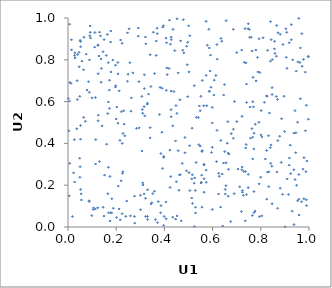
| Category | Series 0 |
|---|---|
| 0.9788830764701367 | 0.135 |
| 0.7382933071890104 | 0.785 |
| 0.922419389426752 | 0.391 |
| 0.5246746633130456 | 0.003 |
| 0.9009848426879103 | 0.001 |
| 0.13757059541510575 | 0.693 |
| 0.7861309197115104 | 0.812 |
| 0.8012970979670199 | 0.557 |
| 0.6066466531327434 | 0.703 |
| 0.7206055139371255 | 0.846 |
| 0.8918531277714573 | 0.873 |
| 0.9851581520181478 | 0.461 |
| 0.6503952192550411 | 0.361 |
| 0.39016531061259596 | 0.664 |
| 0.40634355737657857 | 0.12 |
| 0.8395344020329946 | 0.38 |
| 0.14166029385043155 | 0.484 |
| 0.9693484047753768 | 0.121 |
| 0.8329239313316334 | 0.193 |
| 0.6608357174120479 | 0.401 |
| 0.5238255741605297 | 0.21 |
| 0.9074897839846771 | 0.931 |
| 0.645327951556222 | 0.306 |
| 0.09363841455462474 | 0.904 |
| 0.22802641962514114 | 0.448 |
| 0.012447642685813554 | 0.688 |
| 0.2024713210498681 | 0.574 |
| 0.5914809882413423 | 0.822 |
| 0.35891170513379667 | 0.171 |
| 0.8716884901674705 | 0.929 |
| 0.18179256835252955 | 0.135 |
| 0.45722532153006346 | 0.365 |
| 0.04926195892515939 | 0.238 |
| 0.7479318064712766 | 0.252 |
| 0.5628640049237 | 0.58 |
| 0.0850969620247587 | 0.695 |
| 0.7006693236068876 | 0.504 |
| 0.16547356543540015 | 0.159 |
| 0.1978469605618598 | 0.676 |
| 0.5560725394042293 | 0.095 |
| 0.6528575206712514 | 0.158 |
| 0.0577415820642837 | 0.794 |
| 0.02618950449649926 | 0.418 |
| 0.06430454235327943 | 0.752 |
| 0.12521641857985966 | 0.733 |
| 0.39720550814002875 | 0.338 |
| 0.3004063152671168 | 0.152 |
| 0.7404438260157437 | 0.155 |
| 0.46039513637089746 | 0.176 |
| 0.05583095283742301 | 0.129 |
| 0.4966629162248133 | 0.624 |
| 0.6857580609108529 | 0.946 |
| 0.54073899095779 | 0.524 |
| 0.8328860955450558 | 0.264 |
| 0.3627456096981492 | 0.035 |
| 0.20757749254034075 | 0.497 |
| 0.1768780409662728 | 0.885 |
| 0.5647698343265182 | 0.231 |
| 0.9717300889171576 | 0.769 |
| 0.1878762427767955 | 0.09 |
| 0.3987734250324808 | 0.051 |
| 0.5735676920985348 | 0.214 |
| 0.2918097344787509 | 0.952 |
| 0.9086237270448997 | 0.759 |
| 0.99756643968055 | 0.817 |
| 0.10615950743816882 | 0.092 |
| 0.014698193202679843 | 0.848 |
| 0.11410745307937187 | 0.619 |
| 0.6862797325193554 | 0.468 |
| 0.409765797323961 | 0.761 |
| 0.7050050431588264 | 0.277 |
| 0.23964999315275015 | 0.051 |
| 0.7272797076878672 | 0.152 |
| 0.7477184067683503 | 0.948 |
| 0.40787600807414814 | 0.654 |
| 0.8904848594815173 | 0.157 |
| 0.8468103401479596 | 0.634 |
| 0.15158947626140984 | 0.248 |
| 0.564307607845407 | 0.297 |
| 0.8258029213869033 | 0.625 |
| 0.37993986850533745 | 0.538 |
| 0.51586220676476 | 0.25 |
| 0.06494751309574442 | 0.524 |
| 0.2769418660654832 | 0.018 |
| 0.8279613476488047 | 0.262 |
| 0.037958230017644534 | 0.7 |
| 0.45249228165181055 | 0.053 |
| 0.3215328176127893 | 0.909 |
| 0.9752978211261253 | 0.277 |
| 0.7995915645724786 | 0.238 |
| 0.20003465051286917 | 0.517 |
| 0.050472322563464456 | 0.893 |
| 0.9624332062783065 | 0.787 |
| 0.4644227741199425 | 0.609 |
| 0.3411798170687804 | 0.824 |
| 0.6341779589416399 | 0.414 |
| 0.39256466865036355 | 0.28 |
| 0.19718787627959644 | 0.669 |
| 0.3543116415377553 | 0.932 |
| 0.3168423477531854 | 0.728 |
| 0.6554537561566522 | 0.198 |
| 0.4759097856479214 | 0.846 |
| 0.788018936689581 | 0.742 |
| 0.6525291774734043 | 0.18 |
| 0.6182880074683472 | 0.462 |
| 0.7794856989981469 | 0.847 |
| 0.6137346590519028 | 0.725 |
| 0.5257013404951963 | 0.235 |
| 0.7667410620202002 | 0.326 |
| 0.036537463048250896 | 0.47 |
| 0.7519884673999923 | 0.945 |
| 0.006253275116668622 | 0.602 |
| 0.22462729882480748 | 0.879 |
| 0.7574993245875702 | 0.425 |
| 0.6052917720973204 | 0.631 |
| 0.359358484337032 | 0.734 |
| 0.937946357750658 | 0.011 |
| 0.663274372082392 | 0.504 |
| 0.4234886691871771 | 0.189 |
| 0.9577212795687228 | 0.998 |
| 0.25373326832232634 | 0.948 |
| 0.7212394964750922 | 0.274 |
| 0.9146967598435058 | 0.155 |
| 0.6561115781707576 | 0.987 |
| 0.04897341246033626 | 0.625 |
| 0.3228856144311917 | 0.876 |
| 0.8702857374086754 | 0.414 |
| 0.2245338575189153 | 0.064 |
| 0.814946428758561 | 0.597 |
| 0.5522748240611344 | 0.211 |
| 0.21207279755472952 | 0.086 |
| 0.0878533524828331 | 0.125 |
| 0.4918684270011062 | 0.865 |
| 0.3438220107121758 | 0.672 |
| 0.9909553667037516 | 0.316 |
| 0.9642075798607271 | 0.857 |
| 0.052092967386128564 | 0.42 |
| 0.8659688262326879 | 0.964 |
| 0.8473454626048769 | 0.801 |
| 0.8695974765367401 | 0.61 |
| 0.4189729619461101 | 0.759 |
| 0.5862513613899314 | 0.857 |
| 0.7764711677575098 | 0.077 |
| 0.13089056670775723 | 0.313 |
| 0.17174233751759416 | 0.655 |
| 0.24700931754333288 | 0.929 |
| 0.5239500575731835 | 0.676 |
| 0.7715454594392036 | 0.17 |
| 0.5049280016230397 | 0.389 |
| 0.48537794038931215 | 0.355 |
| 0.8094717363896623 | 0.906 |
| 0.9588225335184156 | 0.057 |
| 0.8413037372047407 | 0.304 |
| 0.14925801575140096 | 0.052 |
| 0.32201505896335925 | 0.05 |
| 0.3287276220706685 | 0.588 |
| 0.9575607454515153 | 0.133 |
| 0.028942802642488275 | 0.833 |
| 0.9486735641276742 | 0.199 |
| 0.9039630232722509 | 0.948 |
| 0.7346892622683334 | 0.949 |
| 0.11525992293871001 | 0.418 |
| 0.20876669203088627 | 0.196 |
| 0.14577898659285105 | 0.094 |
| 0.10448045750653112 | 0.084 |
| 0.11063017823287968 | 0.861 |
| 0.598904352510975 | 0.084 |
| 0.046534256561774456 | 0.766 |
| 0.43569323831768414 | 0.946 |
| 0.3304369704858645 | 0.036 |
| 0.5280730686701354 | 0.175 |
| 0.4392688701106644 | 0.648 |
| 0.5868263556539096 | 0.65 |
| 0.16494405635142362 | 0.543 |
| 0.7650191477155217 | 0.055 |
| 0.42502142216839933 | 0.875 |
| 0.20137354168486088 | 0.045 |
| 0.09217879022033748 | 0.931 |
| 0.2311375772875267 | 0.556 |
| 0.564848076367678 | 0.167 |
| 0.9418712209915094 | 0.227 |
| 0.3898238184745393 | 0.453 |
| 0.43469263399967883 | 0.484 |
| 0.344399637731275 | 0.11 |
| 0.9526292796924435 | 0.501 |
| 0.9582303029637308 | 0.251 |
| 0.13454905232939318 | 0.914 |
| 0.9899042573547616 | 0.102 |
| 0.4284094020128212 | 0.909 |
| 0.22054653497255694 | 0.221 |
| 0.2467759460425757 | 0.697 |
| 0.04580243187503619 | 0.836 |
| 0.9967554322299186 | 0.814 |
| 0.7696754126983404 | 0.575 |
| 0.7711898886860215 | 0.373 |
| 0.49487723718483123 | 0.776 |
| 0.5556890239525735 | 0.361 |
| 0.31084274522242383 | 0.201 |
| 0.5289327664910526 | 0.067 |
| 0.9302433048715683 | 0.076 |
| 0.16037425152207607 | 0.396 |
| 0.4071750474420016 | 0.039 |
| 0.5983778175819708 | 0.572 |
| 0.06614565831284269 | 0.908 |
| 0.12487502026103714 | 0.508 |
| 0.2954116916967424 | 0.474 |
| 0.050383479496209804 | 0.288 |
| 0.443094810235769 | 0.844 |
| 0.7412850686459859 | 0.596 |
| 0.57317628970844 | 0.984 |
| 0.7770699617502416 | 0.492 |
| 0.3715509850451689 | 0.021 |
| 0.004109447909577124 | 0.46 |
| 0.4740302208613534 | 0.304 |
| 0.006917259156896671 | 0.304 |
| 0.970324820137209 | 0.925 |
| 0.9368520280987591 | 0.449 |
| 0.36636135480245013 | 0.89 |
| 0.23560333707096248 | 0.436 |
| 0.038873171487743274 | 0.61 |
| 0.9871576912779718 | 0.265 |
| 0.14556890022457702 | 0.839 |
| 0.8696138619852614 | 0.089 |
| 0.005029340211640587 | 0.149 |
| 0.17766946025558372 | 0.069 |
| 0.5487017971106336 | 0.387 |
| 0.0889743558811622 | 0.645 |
| 0.05215404628095177 | 0.486 |
| 0.7663725204933971 | 0.43 |
| 0.9267203235396823 | 0.968 |
| 0.640000731731857 | 0.253 |
| 0.937086474164822 | 0.274 |
| 0.7392725490903436 | 0.395 |
| 0.8238301316289355 | 0.627 |
| 0.9264226385302766 | 0.896 |
| 0.9188516388722457 | 0.33 |
| 0.9325826518353123 | 0.8 |
| 0.6774510289119021 | 0.447 |
| 0.500386315313976 | 0.963 |
| 0.9096549176113312 | 0.23 |
| 0.5732542230182486 | 0.726 |
| 0.6276295128694394 | 0.243 |
| 0.7941175434423031 | 0.05 |
| 0.7356604698555738 | 0.03 |
| 0.5864771343540965 | 0.649 |
| 0.19695746489892996 | 0.774 |
| 0.8458771008491125 | 0.29 |
| 0.8045689596386693 | 0.431 |
| 0.2842288585420508 | 0.472 |
| 0.41180602647156983 | 0.729 |
| 0.7804707786292285 | 0.699 |
| 0.3696041021049229 | 0.951 |
| 0.5057710590017306 | 0.174 |
| 0.3158528646399652 | 0.576 |
| 0.8782560624427771 | 0.434 |
| 0.11346663151394198 | 0.086 |
| 0.8806544015044495 | 0.922 |
| 0.7198377164430155 | 0.074 |
| 0.15907422043943165 | 0.821 |
| 0.9529509824511145 | 0.125 |
| 0.5515238792398056 | 0.625 |
| 0.5954124800391235 | 0.357 |
| 0.42802819975690387 | 0.65 |
| 0.6160051383527008 | 0.313 |
| 0.763378258421728 | 0.47 |
| 0.9179026715155824 | 0.882 |
| 0.5148105389704084 | 0.473 |
| 0.3478964414410187 | 0.116 |
| 0.5326977484151305 | 0.525 |
| 0.26111336480962133 | 0.554 |
| 0.8861093169875923 | 0.518 |
| 0.3296961430154385 | 0.051 |
| 0.9847876221951813 | 0.741 |
| 0.5548248548260684 | 0.248 |
| 0.4464359980158378 | 0.412 |
| 0.08780951576311835 | 0.122 |
| 0.3083939626663832 | 0.562 |
| 0.3663129659429071 | 0.821 |
| 0.9972631809582544 | 0.516 |
| 0.4466419541183815 | 0.038 |
| 0.1684909965561885 | 0.068 |
| 0.8566640994979111 | 0.852 |
| 0.7642651151228755 | 0.842 |
| 0.531691081643324 | 0.309 |
| 0.3065060827660486 | 0.364 |
| 0.7477738161823179 | 0.188 |
| 0.7934166982831142 | 0.206 |
| 0.553547765281652 | 0.214 |
| 0.4278098655829041 | 0.562 |
| 0.8849297527715001 | 0.309 |
| 0.6661837981214132 | 0.276 |
| 0.5290186694659768 | 0.095 |
| 0.29439866326827213 | 0.696 |
| 0.5986835769145513 | 0.498 |
| 0.7719875756107286 | 0.449 |
| 0.7228236875297045 | 0.287 |
| 0.6645133373027232 | 0.353 |
| 0.48070693591810887 | 0.833 |
| 0.7541948252287335 | 0.908 |
| 0.3301319412602688 | 0.178 |
| 0.8402377162706207 | 0.983 |
| 0.7921894760078803 | 0.501 |
| 0.2757566347520435 | 0.148 |
| 0.31027629003296997 | 0.211 |
| 0.4212212560046854 | 0.99 |
| 0.1143334673801718 | 0.301 |
| 0.17233875627389206 | 0.702 |
| 0.6193290229466867 | 0.803 |
| 0.7366363539746595 | 0.265 |
| 0.575469492237129 | 0.58 |
| 0.7678769336042989 | 0.716 |
| 0.8398850668602286 | 0.793 |
| 0.4852965210839869 | 0.428 |
| 0.17376192049074646 | 0.242 |
| 0.5053988810875789 | 0.915 |
| 0.4263673104515042 | 0.241 |
| 0.007823327640482658 | 0.692 |
| 0.13737833234332952 | 0.804 |
| 0.667684180320692 | 0.349 |
| 0.04015463097354466 | 0.825 |
| 0.30651133772923245 | 0.625 |
| 0.17753456255719757 | 0.938 |
| 0.24381492910116354 | 0.124 |
| 0.8242586995053112 | 0.366 |
| 0.723412219200501 | 0.166 |
| 0.3821229997134661 | 0.668 |
| 0.1631448812109042 | 0.921 |
| 0.39631185523884627 | 0.963 |
| 0.18075463994690277 | 0.067 |
| 0.5931754705047153 | 0.669 |
| 0.12423195920209795 | 0.869 |
| 0.49172476106052365 | 0.269 |
| 0.5484412193671911 | 0.556 |
| 0.09182984703702146 | 0.962 |
| 0.08892800346631058 | 0.8 |
| 0.8281856213084362 | 0.845 |
| 0.2915295262835558 | 0.913 |
| 0.9772068808031642 | 0.802 |
| 0.21559700414266036 | 0.415 |
| 0.502351822322706 | 0.742 |
| 0.07191384867572281 | 0.506 |
| 0.38595793823487723 | 0.102 |
| 0.792665979536697 | 0.901 |
| 0.38549761357664314 | 0.351 |
| 0.5900748095456548 | 0.746 |
| 0.3407161734742328 | 0.426 |
| 0.3843988963336886 | 0.068 |
| 0.25680805195516443 | 0.786 |
| 0.46563887532018344 | 0.25 |
| 0.6245083715584872 | 0.158 |
| 0.8646196681046784 | 0.817 |
| 0.5024496204420347 | 0.26 |
| 0.316752246470688 | 0.662 |
| 0.6255600722163915 | 0.257 |
| 0.7316497065680242 | 0.788 |
| 0.6649672008802103 | 0.148 |
| 0.8588355944336484 | 0.83 |
| 0.5572294760222466 | 0.365 |
| 0.4573297259598823 | 0.737 |
| 0.5131972092283129 | 0.139 |
| 0.45193254883975265 | 0.543 |
| 0.4283630045737371 | 0.528 |
| 0.7560681429229573 | 0.574 |
| 0.9889733060216763 | 0.13 |
| 0.12313709526893302 | 0.092 |
| 0.8470897162842106 | 0.111 |
| 0.5781451219719983 | 0.87 |
| 0.12836368920481533 | 0.818 |
| 0.7371810994304477 | 0.378 |
| 0.3742575874905646 | 0.121 |
| 0.428795133268532 | 0.896 |
| 0.32993938410859525 | 0.592 |
| 0.9055769015520542 | 0.812 |
| 0.7293479446973019 | 0.266 |
| 0.2757267602149327 | 0.051 |
| 0.8038946744654075 | 0.053 |
| 0.8806453097506495 | 0.186 |
| 0.21265791482867347 | 0.651 |
| 0.07912786639251623 | 0.655 |
| 0.05201610642999832 | 0.18 |
| 0.7666612784485285 | 0.599 |
| 0.3009032232409853 | 0.083 |
| 0.7602370979009195 | 0.908 |
| 0.947391823448269 | 0.746 |
| 0.8422851197789122 | 0.393 |
| 0.6351602848802358 | 0.902 |
| 0.39724777124640387 | 0.333 |
| 0.37045326955100566 | 0.925 |
| 0.7126329371993323 | 0.193 |
| 0.7404811365912543 | 0.684 |
| 0.23294110062038442 | 0.492 |
| 0.564626553164157 | 0.3 |
| 0.5430287493675023 | 0.394 |
| 0.40878875351254007 | 0.882 |
| 0.44805347757581504 | 0.581 |
| 0.6457250414392742 | 0.632 |
| 0.22604805640612602 | 0.256 |
| 0.3931239537590445 | 0.956 |
| 0.3341964212503863 | 0.636 |
| 0.9893091161640917 | 0.583 |
| 0.8666593694349821 | 0.263 |
| 0.7004010820543147 | 0.834 |
| 0.49663417063649384 | 0.884 |
| 0.01841617890409608 | 0.05 |
| 0.5133085164078875 | 0.23 |
| 0.3518285371276333 | 0.16 |
| 0.0291833724494569 | 0.809 |
| 0.052092796740600855 | 0.862 |
| 0.6894931477910153 | 0.159 |
| 0.6751074933064569 | 0.026 |
| 0.40679554847164534 | 0.904 |
| 0.8007122828803034 | 0.441 |
| 0.027317261538046034 | 0.215 |
| 0.2493422907192957 | 0.731 |
| 0.618053841987043 | 0.873 |
| 0.979017132807881 | 0.332 |
| 0.8989385498530797 | 0.456 |
| 0.5846711615846395 | 0.946 |
| 0.31594012360252066 | 0.158 |
| 0.42271512048331383 | 0.368 |
| 0.16738027817912338 | 0.787 |
| 0.216863587233164 | 0.034 |
| 0.6561142486820779 | 0.307 |
| 0.6329674835873351 | 0.095 |
| 0.8320606970423614 | 0.437 |
| 0.8643005827030631 | 0.624 |
| 0.16753724922087232 | 0.285 |
| 0.20778541664131245 | 0.733 |
| 0.9179054163250285 | 0.296 |
| 0.1259278965538737 | 0.535 |
| 0.17197922312785519 | 0.568 |
| 0.09025318550865147 | 0.915 |
| 0.9419421135515267 | 0.557 |
| 0.7221692548403635 | 0.529 |
| 0.6380937768344286 | 0.889 |
| 0.17426172311854227 | 0.029 |
| 0.7239720740500679 | 0.174 |
| 0.5166135165350463 | 0.113 |
| 0.857270396458447 | 0.888 |
| 0.9641436703483158 | 0.614 |
| 0.26293832170321607 | 0.618 |
| 0.13842592294257738 | 0.759 |
| 0.46263196972920506 | 0.249 |
| 0.09982484685219295 | 0.618 |
| 0.0987221755435268 | 0.054 |
| 0.4347814305993619 | 0.047 |
| 0.14975864607064393 | 0.897 |
| 0.8357945000373552 | 0.545 |
| 0.6491909628784247 | 0.681 |
| 0.7481163871379161 | 0.972 |
| 0.006192987699404684 | 0.97 |
| 0.2693323041920975 | 0.738 |
| 0.9244026976190725 | 0.256 |
| 0.11132448594179623 | 0.931 |
| 0.4788971016994791 | 0.992 |
| 0.34103048361607546 | 0.475 |
| 0.9449423365913078 | 0.356 |
| 0.31837279066202484 | 0.532 |
| 0.5733618157227761 | 0.272 |
| 0.2276777957186562 | 0.265 |
| 0.4671795879343652 | 0.891 |
| 0.2182989966061113 | 0.895 |
| 0.05451301634560968 | 0.159 |
| 0.8960594548471664 | 0.625 |
| 0.023092322202881377 | 0.259 |
| 0.027410364247804964 | 0.821 |
| 0.5574634525932739 | 0.702 |
| 0.001509781514464792 | 0.614 |
| 0.13068929027479537 | 0.932 |
| 0.39681687281073263 | 0.008 |
| 0.12462836787014508 | 0.871 |
| 0.8427653445063785 | 0.897 |
| 0.32173200621948306 | 0.137 |
| 0.9539720755116264 | 0.79 |
| 0.5450947273228095 | 0.579 |
| 0.186153349431737 | 0.799 |
| 0.22515592146832164 | 0.4 |
| 0.25902595019841457 | 0.053 |
| 0.206875307986631 | 0.787 |
| 0.8247522033012041 | 0.133 |
| 0.4494833710715156 | 0.216 |
| 0.6419202816945627 | 0.005 |
| 0.0518865378271981 | 0.887 |
| 0.31025410747770643 | 0.544 |
| 0.048256217406726476 | 0.329 |
| 0.6863535249325381 | 0.425 |
| 0.16761291137535328 | 0.598 |
| 0.7719476601077513 | 0.069 |
| 0.014428152623863544 | 0.896 |
| 0.4697107870352162 | 0.03 |
| 0.9454814635045503 | 0.451 |
| 0.8189015005848419 | 0.325 |
| 0.8468422296507155 | 0.667 |
| 0.17783483322061533 | 0.742 |
| 0.07550036446042074 | 0.827 |
| 0.7960743853632728 | 0.739 |
| 0.4524383878741678 | 0.996 |
| 0.598713424588138 | 0.381 |
| 0.6905978986226882 | 0.6 |
| 0.22163966233922183 | 0.551 |